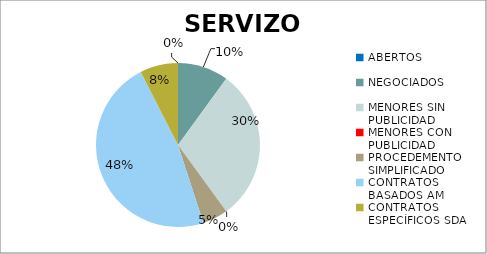
| Category | Series 0 |
|---|---|
| ABERTOS  | 0 |
| NEGOCIADOS  | 0.1 |
| MENORES SIN PUBLICIDAD | 0.3 |
| MENORES CON PUBLICIDAD | 0 |
| PROCEDEMENTO SIMPLIFICADO | 0.05 |
| CONTRATOS BASADOS AM | 0.475 |
| CONTRATOS ESPECÍFICOS SDA | 0.075 |